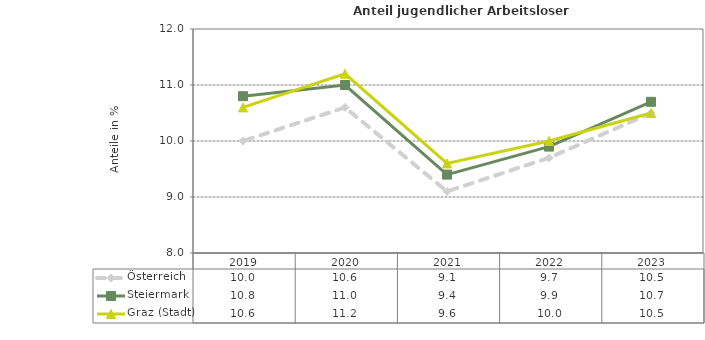
| Category | Österreich | Steiermark | Graz (Stadt) |
|---|---|---|---|
| 2023.0 | 10.5 | 10.7 | 10.5 |
| 2022.0 | 9.7 | 9.9 | 10 |
| 2021.0 | 9.1 | 9.4 | 9.6 |
| 2020.0 | 10.6 | 11 | 11.2 |
| 2019.0 | 10 | 10.8 | 10.6 |